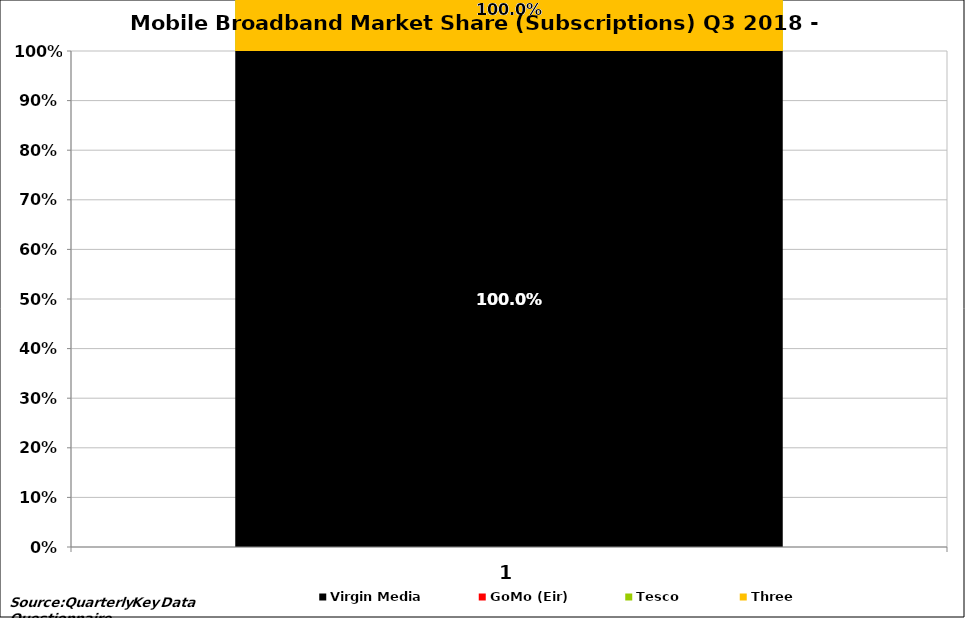
| Category | Virgin Media | GoMo (Eir) | Tesco | Three |
|---|---|---|---|---|
| 0 | 1 | 1 | 1 | 1 |